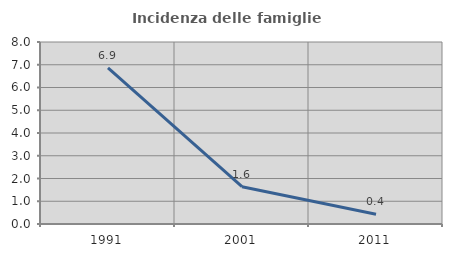
| Category | Incidenza delle famiglie numerose |
|---|---|
| 1991.0 | 6.862 |
| 2001.0 | 1.64 |
| 2011.0 | 0.429 |